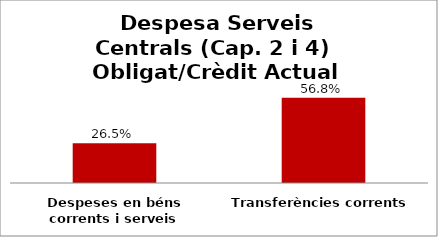
| Category | Series 0 |
|---|---|
| Despeses en béns corrents i serveis | 0.265 |
| Transferències corrents | 0.568 |